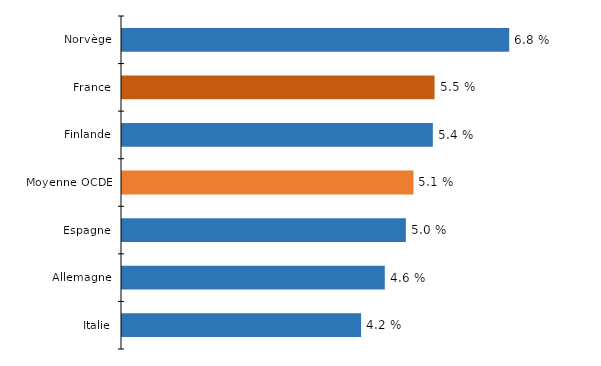
| Category | Series 0 |
|---|---|
| Italie | 4.186 |
| Allemagne | 4.6 |
| Espagne | 4.969 |
| Moyenne OCDE | 5.102 |
| Finlande | 5.441 |
| France | 5.472 |
| Norvège | 6.779 |